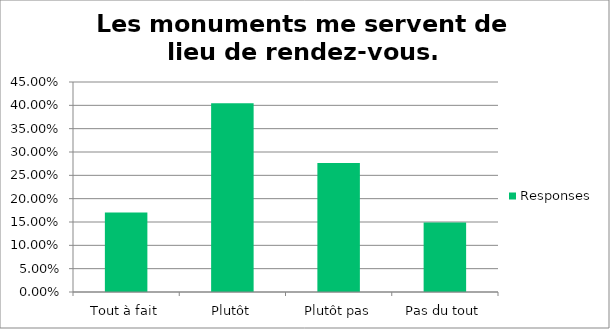
| Category | Responses |
|---|---|
| Tout à fait | 0.17 |
| Plutôt | 0.404 |
| Plutôt pas | 0.277 |
| Pas du tout | 0.149 |